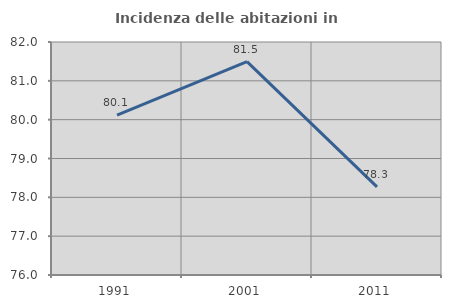
| Category | Incidenza delle abitazioni in proprietà  |
|---|---|
| 1991.0 | 80.118 |
| 2001.0 | 81.494 |
| 2011.0 | 78.269 |